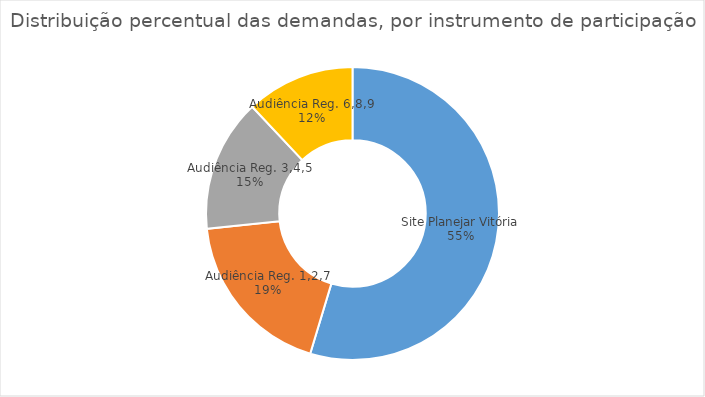
| Category | Fonte da participação |
|---|---|
| Site Planejar Vitória | 41 |
| Audiência Reg. 1,2,7 | 14 |
| Audiência Reg. 3,4,5 | 11 |
| Audiência Reg. 6,8,9 | 9 |